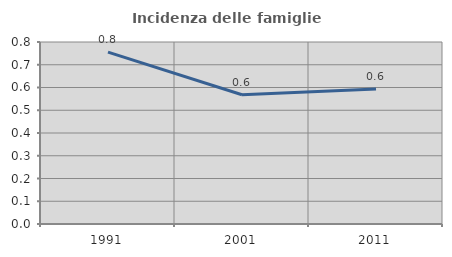
| Category | Incidenza delle famiglie numerose |
|---|---|
| 1991.0 | 0.756 |
| 2001.0 | 0.568 |
| 2011.0 | 0.593 |